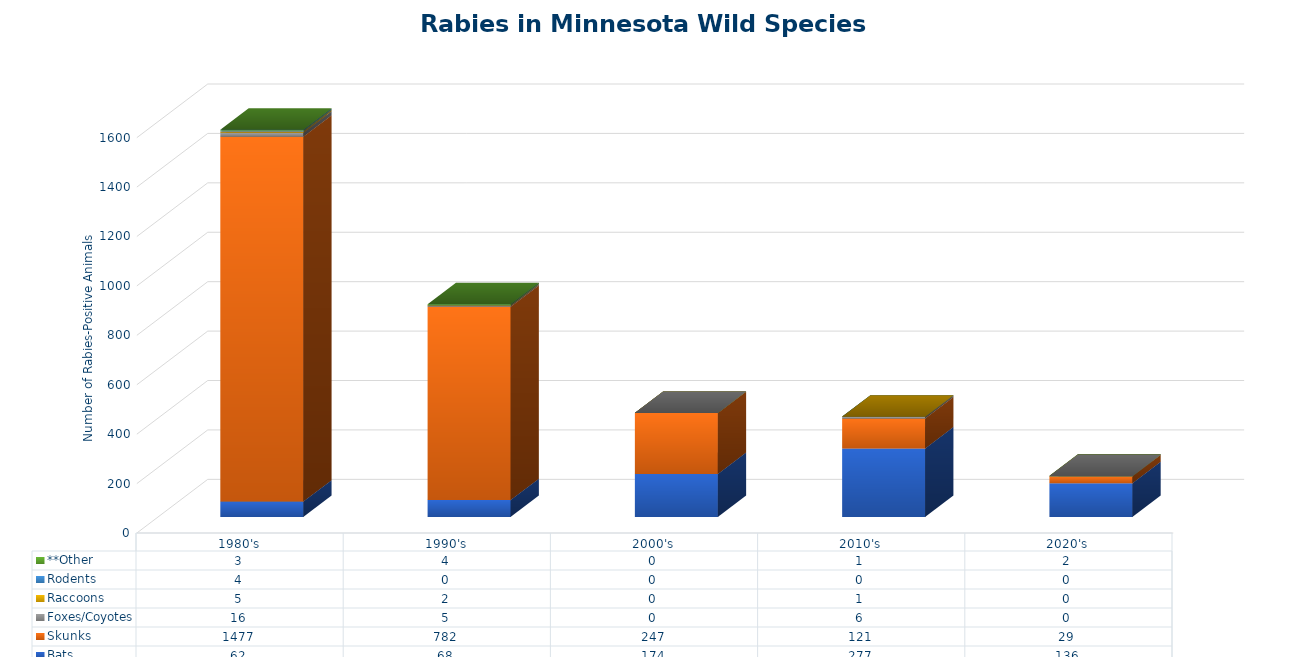
| Category | Bats  | Skunks  | Foxes/Coyotes | Raccoons  | Rodents  | **Other  |
|---|---|---|---|---|---|---|
| 1980's | 62 | 1477 | 16 | 5 | 4 | 3 |
| 1990's | 68 | 782 | 5 | 2 | 0 | 4 |
| 2000's | 174 | 247 | 0 | 0 | 0 | 0 |
| 2010's | 277 | 121 | 6 | 1 | 0 | 1 |
| 2020's | 136 | 29 | 0 | 0 | 0 | 2 |